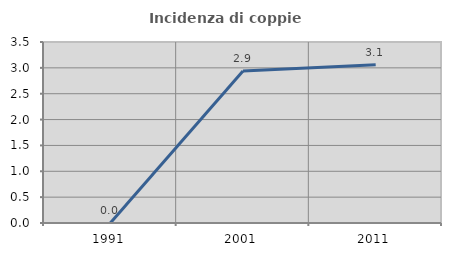
| Category | Incidenza di coppie miste |
|---|---|
| 1991.0 | 0 |
| 2001.0 | 2.941 |
| 2011.0 | 3.061 |